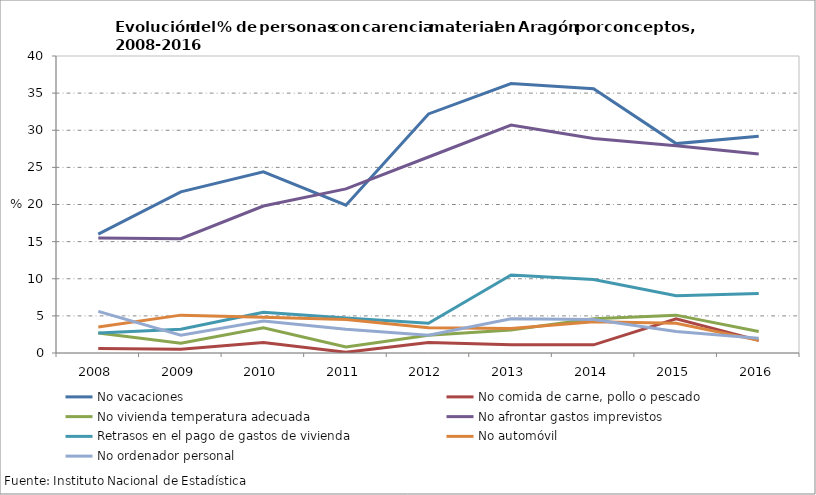
| Category | No vacaciones | No comida de carne, pollo o pescado | No vivienda temperatura adecuada | No afrontar gastos imprevistos | Retrasos en el pago de gastos de vivienda | No automóvil | No ordenador personal |
|---|---|---|---|---|---|---|---|
| 2008.0 | 16 | 0.6 | 2.7 | 15.5 | 2.7 | 3.5 | 5.6 |
| 2009.0 | 21.7 | 0.5 | 1.3 | 15.4 | 3.2 | 5.1 | 2.4 |
| 2010.0 | 24.4 | 1.4 | 3.4 | 19.8 | 5.5 | 4.8 | 4.3 |
| 2011.0 | 19.9 | 0.1 | 0.8 | 22.1 | 4.7 | 4.5 | 3.2 |
| 2012.0 | 32.2 | 1.4 | 2.4 | 26.4 | 4 | 3.4 | 2.4 |
| 2013.0 | 36.3 | 1.1 | 3.1 | 30.7 | 10.5 | 3.3 | 4.6 |
| 2014.0 | 35.6 | 1.1 | 4.6 | 28.9 | 9.9 | 4.2 | 4.5 |
| 2015.0 | 28.2 | 4.6 | 5.1 | 27.9 | 7.7 | 4 | 2.9 |
| 2016.0 | 29.2 | 1.7 | 2.9 | 26.8 | 8 | 1.7 | 2 |